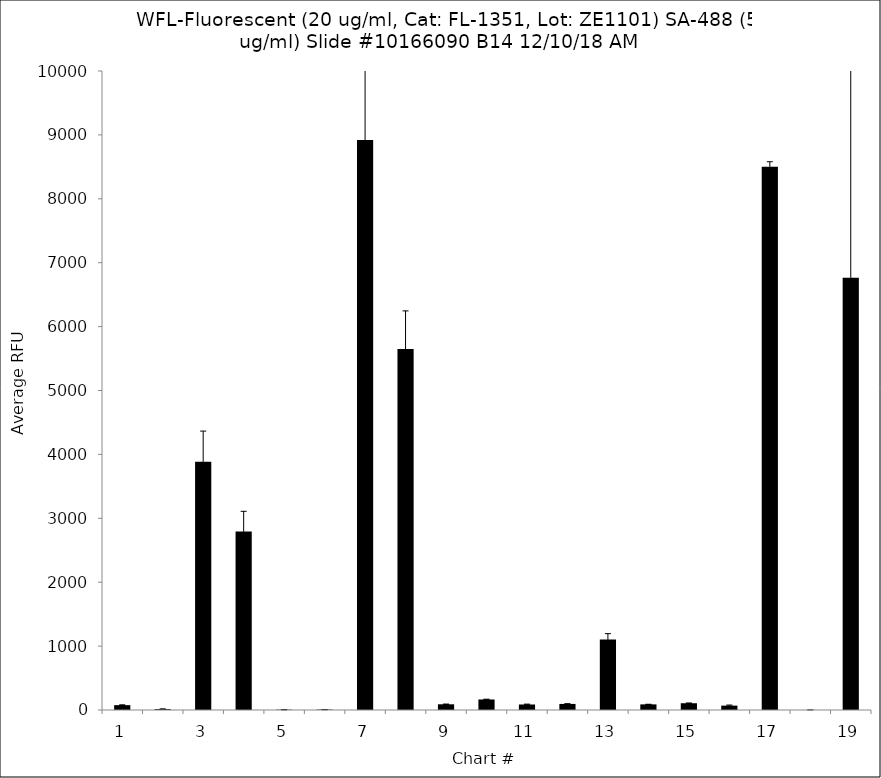
| Category | Series 0 |
|---|---|
| 1.0 | 75.75 |
| 2.0 | 14.25 |
| 3.0 | 3883.5 |
| 4.0 | 2794.75 |
| 5.0 | 5 |
| 6.0 | 6.25 |
| 7.0 | 8921.5 |
| 8.0 | 5649.25 |
| 9.0 | 89.25 |
| 10.0 | 164.75 |
| 11.0 | 86.25 |
| 12.0 | 95 |
| 13.0 | 1103 |
| 14.0 | 88 |
| 15.0 | 106 |
| 16.0 | 68.5 |
| 17.0 | 8503.5 |
| 18.0 | 0.75 |
| 19.0 | 6765.25 |